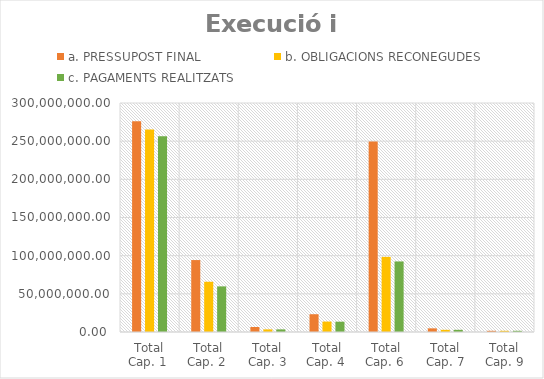
| Category | a. PRESSUPOST FINAL | b. OBLIGACIONS RECONEGUDES | c. PAGAMENTS REALITZATS |
|---|---|---|---|
| Total Cap. 1  | 276089842.75 | 265174291.14 | 256326841.78 |
| Total Cap. 2  | 94236173.22 | 65816118.45 | 59749934.21 |
| Total Cap. 3 | 6573132.28 | 3435938.83 | 3435938.83 |
| Total Cap. 4  | 23297235.14 | 13683368.23 | 13501403.37 |
| Total Cap. 6  | 249554496.7 | 98405439.89 | 92426800.11 |
| Total Cap. 7 | 4777579.27 | 2860401.94 | 2859644.4 |
| Total Cap. 9 | 1565346.68 | 1565340.23 | 1565340.23 |